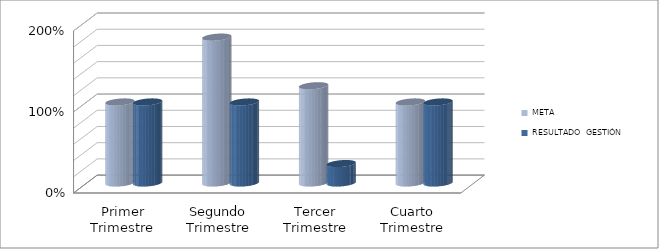
| Category | META | RESULTADO  GESTIÓN PERÍODO |
|---|---|---|
| Primer Trimestre | 1 | 1 |
| Segundo Trimestre | 1.8 | 1 |
| Tercer Trimestre | 1.2 | 0.24 |
| Cuarto Trimestre | 1 | 1 |